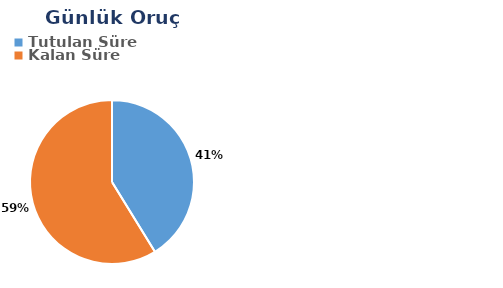
| Category | Günlük |
|---|---|
| Tutulan Süre | 0.24 |
| Kalan Süre | 0.342 |